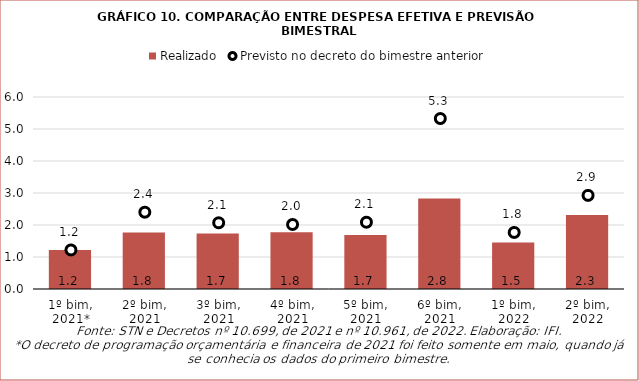
| Category | Realizado |
|---|---|
| 1º bim, 2021* | 1220 |
| 2º bim, 2021 | 1767 |
| 3º bim, 2021 | 1732 |
| 4º bim, 2021 | 1777 |
| 5º bim, 2021 | 1689 |
| 6º bim, 2021 | 2826.53 |
| 1º bim, 2022 | 1454 |
| 2º bim, 2022 | 2312 |